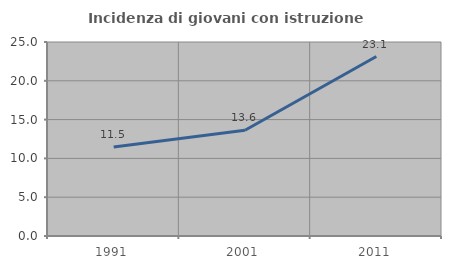
| Category | Incidenza di giovani con istruzione universitaria |
|---|---|
| 1991.0 | 11.458 |
| 2001.0 | 13.631 |
| 2011.0 | 23.126 |